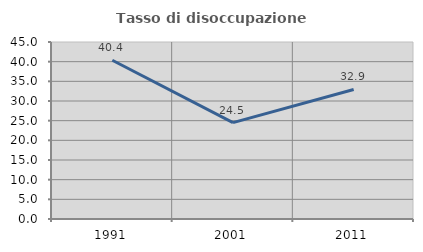
| Category | Tasso di disoccupazione giovanile  |
|---|---|
| 1991.0 | 40.367 |
| 2001.0 | 24.49 |
| 2011.0 | 32.941 |